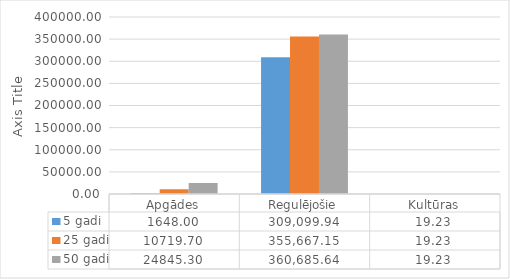
| Category | 5 gadi | 25 gadi | 50 gadi |
|---|---|---|---|
| Apgādes | 1648 | 10719.7 | 24845.3 |
| Regulējošie | 309099.942 | 355667.145 | 360685.637 |
| Kultūras | 19.23 | 19.23 | 19.23 |